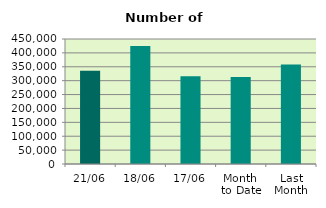
| Category | Series 0 |
|---|---|
| 21/06 | 335764 |
| 18/06 | 424812 |
| 17/06 | 316222 |
| Month 
to Date | 313401.733 |
| Last
Month | 357760.286 |